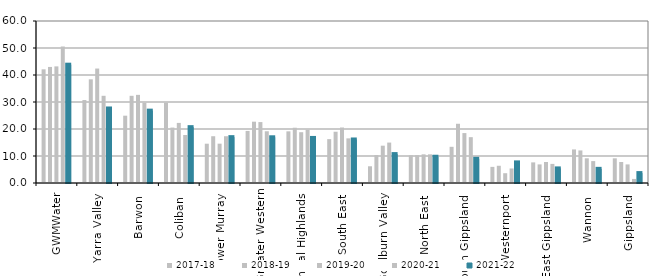
| Category | 2017-18 | 2018-19 | 2019-20 | 2020-21 | 2021-22 |
|---|---|---|---|---|---|
| GWMWater | 42.105 | 42.984 | 43.191 | 50.522 | 43.82 |
| Yarra Valley  | 30.722 | 38.4 | 42.392 | 32.296 | 27.598 |
| Barwon  | 24.934 | 32.292 | 32.642 | 29.745 | 26.799 |
| Coliban  | 29.758 | 20.528 | 22.255 | 17.78 | 20.683 |
| Lower Murray  | 14.552 | 17.325 | 14.565 | 17.327 | 16.981 |
| Greater Western | 19.286 | 22.709 | 22.564 | 19.164 | 16.932 |
| Central Highlands  | 19.134 | 20.469 | 18.809 | 19.722 | 16.688 |
| South East  | 16.248 | 18.99 | 20.549 | 16.53 | 16.119 |
| Goulburn Valley  | 6.197 | 10.347 | 13.822 | 14.971 | 10.706 |
| North East  | 10.253 | 10.294 | 10.613 | 10.615 | 9.726 |
| South Gippsland  | 13.4 | 21.937 | 18.488 | 16.975 | 8.952 |
| Westernport  | 5.973 | 6.383 | 3.629 | 5.383 | 7.632 |
| East Gippsland  | 7.638 | 6.892 | 7.787 | 7.075 | 5.405 |
| Wannon  | 12.434 | 12.065 | 9.154 | 8.11 | 5.242 |
| Gippsland  | 9.138 | 7.775 | 6.889 | 1.501 | 3.67 |